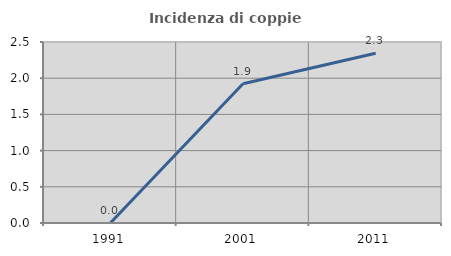
| Category | Incidenza di coppie miste |
|---|---|
| 1991.0 | 0 |
| 2001.0 | 1.923 |
| 2011.0 | 2.344 |